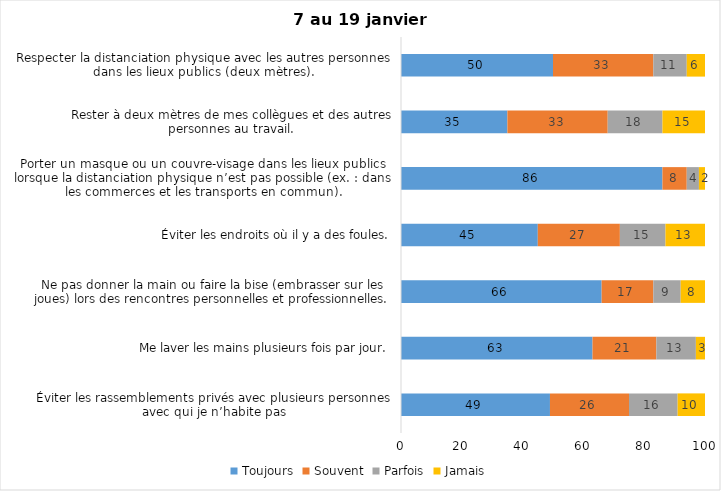
| Category | Toujours | Souvent | Parfois | Jamais |
|---|---|---|---|---|
| Éviter les rassemblements privés avec plusieurs personnes avec qui je n’habite pas | 49 | 26 | 16 | 10 |
| Me laver les mains plusieurs fois par jour. | 63 | 21 | 13 | 3 |
| Ne pas donner la main ou faire la bise (embrasser sur les joues) lors des rencontres personnelles et professionnelles. | 66 | 17 | 9 | 8 |
| Éviter les endroits où il y a des foules. | 45 | 27 | 15 | 13 |
| Porter un masque ou un couvre-visage dans les lieux publics lorsque la distanciation physique n’est pas possible (ex. : dans les commerces et les transports en commun). | 86 | 8 | 4 | 2 |
| Rester à deux mètres de mes collègues et des autres personnes au travail. | 35 | 33 | 18 | 15 |
| Respecter la distanciation physique avec les autres personnes dans les lieux publics (deux mètres). | 50 | 33 | 11 | 6 |